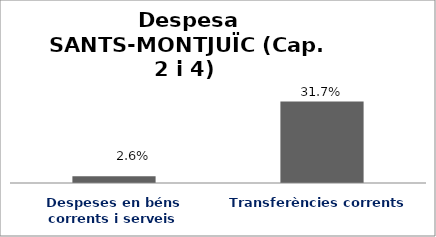
| Category | Series 0 |
|---|---|
| Despeses en béns corrents i serveis | 0.026 |
| Transferències corrents | 0.317 |